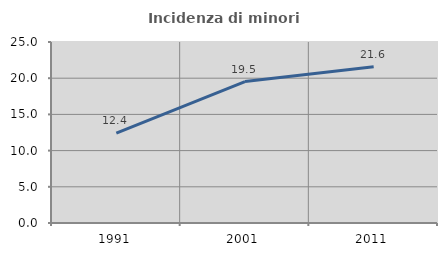
| Category | Incidenza di minori stranieri |
|---|---|
| 1991.0 | 12.414 |
| 2001.0 | 19.531 |
| 2011.0 | 21.589 |